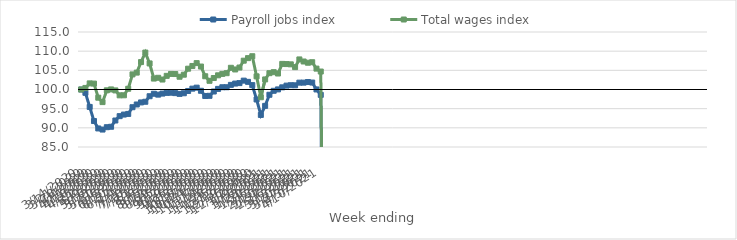
| Category | Payroll jobs index | Total wages index |
|---|---|---|
| 14/03/2020 | 100 | 100 |
| 21/03/2020 | 99.133 | 100.411 |
| 28/03/2020 | 95.455 | 101.596 |
| 04/04/2020 | 91.771 | 101.543 |
| 11/04/2020 | 89.839 | 97.863 |
| 18/04/2020 | 89.551 | 96.715 |
| 25/04/2020 | 90.168 | 99.785 |
| 02/05/2020 | 90.278 | 100.023 |
| 09/05/2020 | 91.913 | 99.763 |
| 16/05/2020 | 93.047 | 98.479 |
| 23/05/2020 | 93.46 | 98.489 |
| 30/05/2020 | 93.628 | 100.193 |
| 06/06/2020 | 95.38 | 103.938 |
| 13/06/2020 | 96.094 | 104.406 |
| 20/06/2020 | 96.628 | 107.153 |
| 27/06/2020 | 96.801 | 109.638 |
| 04/07/2020 | 98.246 | 106.8 |
| 11/07/2020 | 98.891 | 102.851 |
| 18/07/2020 | 98.661 | 103.057 |
| 25/07/2020 | 98.932 | 102.6 |
| 01/08/2020 | 99.117 | 103.559 |
| 08/08/2020 | 99.161 | 104.06 |
| 15/08/2020 | 99.054 | 104.034 |
| 22/08/2020 | 98.858 | 103.327 |
| 29/08/2020 | 99.019 | 103.86 |
| 05/09/2020 | 99.618 | 105.428 |
| 12/09/2020 | 100.221 | 106.139 |
| 19/09/2020 | 100.483 | 106.882 |
| 26/09/2020 | 99.667 | 105.988 |
| 03/10/2020 | 98.31 | 103.454 |
| 10/10/2020 | 98.351 | 102.267 |
| 17/10/2020 | 99.474 | 102.996 |
| 24/10/2020 | 100.161 | 103.698 |
| 31/10/2020 | 100.59 | 104.069 |
| 07/11/2020 | 100.594 | 104.259 |
| 14/11/2020 | 101.209 | 105.664 |
| 21/11/2020 | 101.549 | 105.229 |
| 28/11/2020 | 101.67 | 105.728 |
| 05/12/2020 | 102.312 | 107.52 |
| 12/12/2020 | 101.995 | 108.183 |
| 19/12/2020 | 101.142 | 108.682 |
| 26/12/2020 | 97.403 | 103.429 |
| 02/01/2021 | 93.365 | 97.98 |
| 09/01/2021 | 95.732 | 102.628 |
| 16/01/2021 | 98.63 | 104.262 |
| 23/01/2021 | 99.665 | 104.519 |
| 30/01/2021 | 100.026 | 104.168 |
| 06/02/2021 | 100.565 | 106.678 |
| 13/02/2021 | 101.013 | 106.635 |
| 20/02/2021 | 101.117 | 106.562 |
| 27/02/2021 | 101.094 | 105.834 |
| 06/03/2021 | 101.786 | 107.846 |
| 13/03/2021 | 101.791 | 107.306 |
| 20/03/2021 | 101.946 | 106.984 |
| 27/03/2021 | 101.812 | 107.12 |
| 03/04/2021 | 100.013 | 105.449 |
| 10/04/2021 | 98.596 | 104.686 |